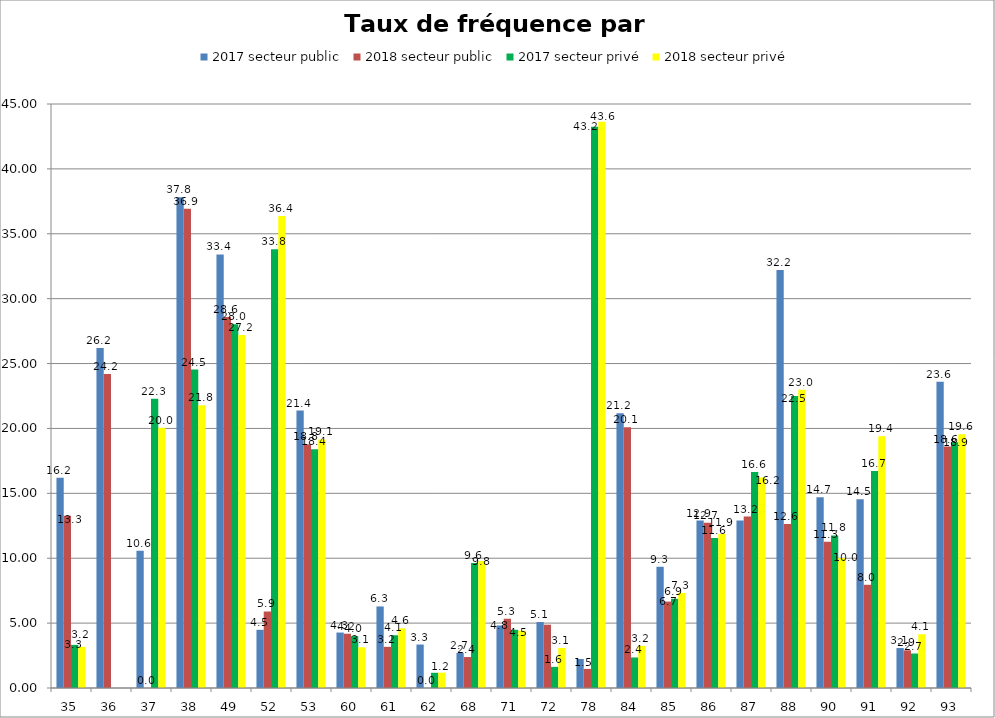
| Category | 2017 secteur public | 2018 secteur public | 2017 secteur privé | 2018 secteur privé |
|---|---|---|---|---|
| 35 | 16.197 | 13.265 | 3.324 | 3.174 |
| 36 | 26.203 | 24.203 | 0 | 0 |
| 37 | 10.573 | 0 | 22.29 | 20.05 |
| 38 | 37.816 | 36.924 | 24.535 | 21.796 |
| 49 | 33.407 | 28.596 | 28.027 | 27.205 |
| 52 | 4.483 | 5.895 | 33.804 | 36.364 |
| 53 | 21.375 | 18.781 | 18.392 | 19.148 |
| 60 | 4.272 | 4.18 | 3.999 | 3.135 |
| 61 | 6.284 | 3.172 | 4.063 | 4.597 |
| 62 | 3.349 | 0 | 1.172 | 1.184 |
| 68 | 2.705 | 2.386 | 9.635 | 9.787 |
| 71 | 4.819 | 5.337 | 4.485 | 4.415 |
| 72 | 5.083 | 4.878 | 1.628 | 3.089 |
| 78 | 2.235 | 1.472 | 43.248 | 43.627 |
| 84 | 21.172 | 20.1 | 2.353 | 3.247 |
| 85 | 9.341 | 6.659 | 6.872 | 7.327 |
| 86 | 12.899 | 12.737 | 11.565 | 11.867 |
| 87 | 12.909 | 13.213 | 16.646 | 16.216 |
| 88 | 32.199 | 12.628 | 22.505 | 22.975 |
| 90 | 14.691 | 11.266 | 11.758 | 10.008 |
| 91 | 14.549 | 7.952 | 16.713 | 19.395 |
| 92 | 3.078 | 2.904 | 2.657 | 4.142 |
| 93 | 23.603 | 18.6 | 18.936 | 19.562 |